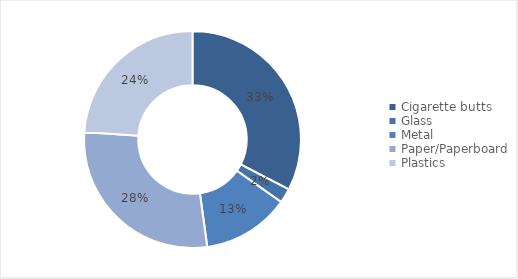
| Category | 2014/15 |
|---|---|
| Cigarette butts | 15 |
| Glass | 1 |
| Metal | 6 |
| Paper/Paperboard | 13 |
| Plastics | 11 |